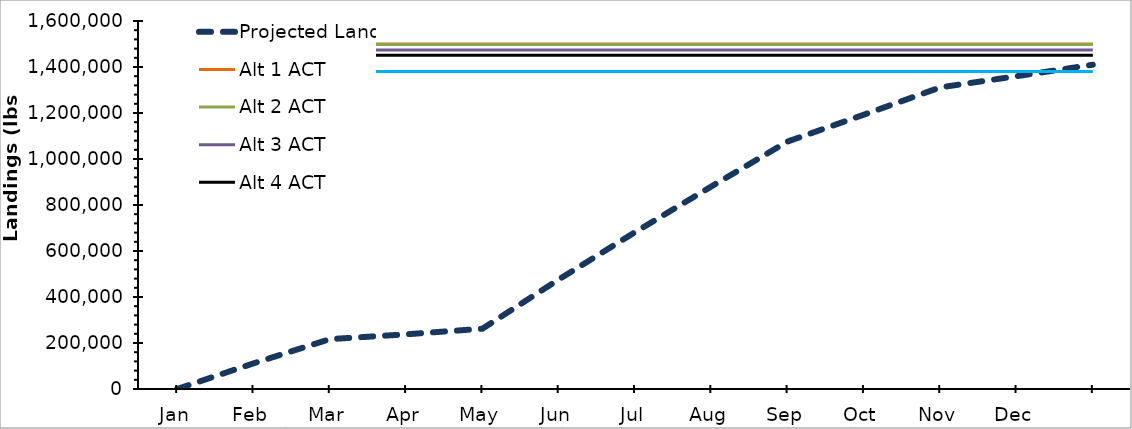
| Category | Projected Landings | Alt 1 ACT | Alt 2 ACT | Alt 3 ACT | Alt 4 ACT | Alt 5 ACT |
|---|---|---|---|---|---|---|
| Jan | 0 | 1500000 | 1497600 | 1474200 | 1450800 | 1380600 |
| Feb | 111472.233 | 1500000 | 1497600 | 1474200 | 1450800 | 1380600 |
| Mar | 216760.333 | 1500000 | 1497600 | 1474200 | 1450800 | 1380600 |
| Apr | 237707.246 | 1500000 | 1497600 | 1474200 | 1450800 | 1380600 |
| May | 262134 | 1500000 | 1497600 | 1474200 | 1450800 | 1380600 |
| Jun | 476045.508 | 1500000 | 1497600 | 1474200 | 1450800 | 1380600 |
| Jul | 681692 | 1500000 | 1497600 | 1474200 | 1450800 | 1380600 |
| Aug | 880483.167 | 1500000 | 1497600 | 1474200 | 1450800 | 1380600 |
| Sep | 1076036.667 | 1500000 | 1497600 | 1474200 | 1450800 | 1380600 |
| Oct | 1192768.355 | 1500000 | 1497600 | 1474200 | 1450800 | 1380600 |
| Nov | 1311394 | 1500000 | 1497600 | 1474200 | 1450800 | 1380600 |
| Dec | 1359961.492 | 1500000 | 1497600 | 1474200 | 1450800 | 1380600 |